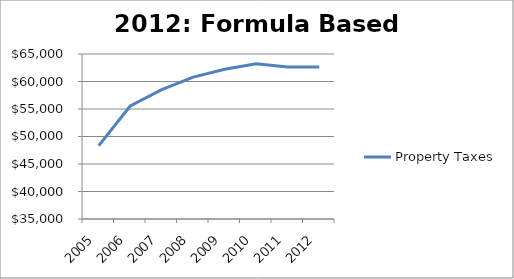
| Category | Property Taxes |
|---|---|
| 2005.0 | 48333 |
| 2006.0 | 55546 |
| 2007.0 | 58536 |
| 2008.0 | 60794 |
| 2009.0 | 62223 |
| 2010.0 | 63241 |
| 2011.0 | 62654 |
| 2012.0 | 62654 |